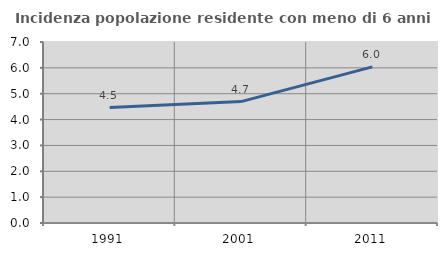
| Category | Incidenza popolazione residente con meno di 6 anni |
|---|---|
| 1991.0 | 4.464 |
| 2001.0 | 4.695 |
| 2011.0 | 6.038 |